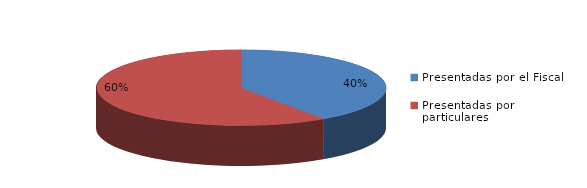
| Category | Series 0 |
|---|---|
| Presentadas por el Fiscal | 78 |
| Presentadas por particulares | 115 |